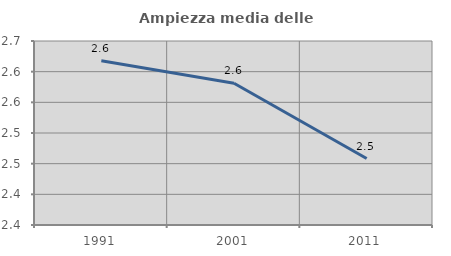
| Category | Ampiezza media delle famiglie |
|---|---|
| 1991.0 | 2.618 |
| 2001.0 | 2.581 |
| 2011.0 | 2.458 |